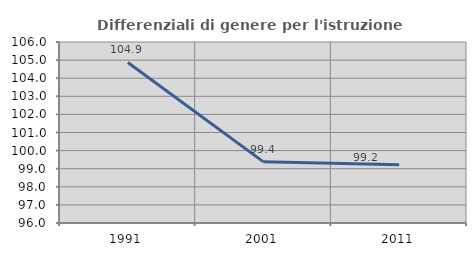
| Category | Differenziali di genere per l'istruzione superiore |
|---|---|
| 1991.0 | 104.87 |
| 2001.0 | 99.379 |
| 2011.0 | 99.222 |